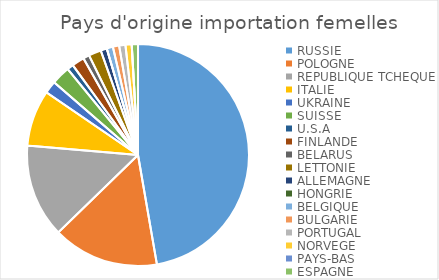
| Category | Series 0 |
|---|---|
| RUSSIE | 52 |
| POLOGNE | 17 |
| REPUBLIQUE TCHEQUE | 15 |
| ITALIE | 9 |
| UKRAINE | 2 |
| SUISSE | 3 |
| U.S.A | 1 |
| FINLANDE | 2 |
| BELARUS | 1 |
| LETTONIE | 2 |
| ALLEMAGNE | 1 |
| HONGRIE | 0 |
| BELGIQUE | 1 |
| BULGARIE | 1 |
| PORTUGAL | 1 |
| NORVEGE | 1 |
| PAYS-BAS | 0 |
| ESPAGNE | 1 |